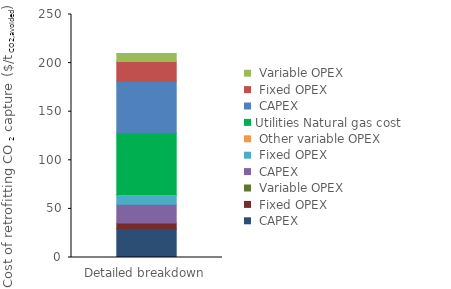
| Category | Interconnecting | Utilities | Series 0 | Series 1 | Series 2 |
|---|---|---|---|---|---|
| 0 | 0 | 63.533 | 53.107 | 20.345 | 8.25 |